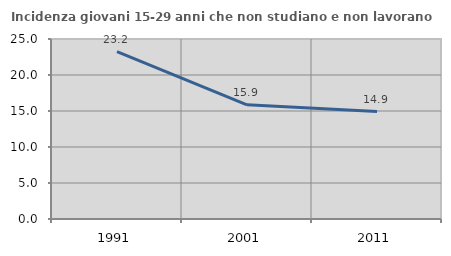
| Category | Incidenza giovani 15-29 anni che non studiano e non lavorano  |
|---|---|
| 1991.0 | 23.243 |
| 2001.0 | 15.856 |
| 2011.0 | 14.923 |